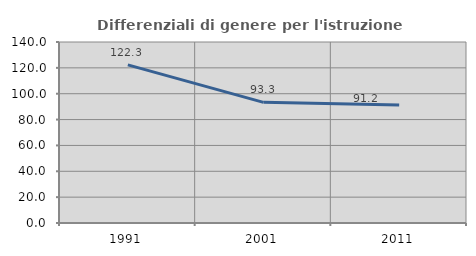
| Category | Differenziali di genere per l'istruzione superiore |
|---|---|
| 1991.0 | 122.348 |
| 2001.0 | 93.323 |
| 2011.0 | 91.198 |